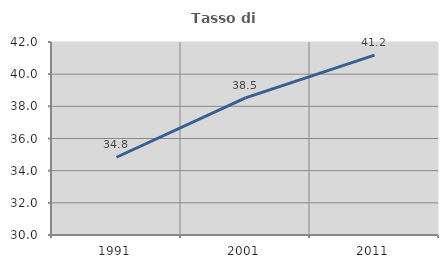
| Category | Tasso di occupazione   |
|---|---|
| 1991.0 | 34.834 |
| 2001.0 | 38.521 |
| 2011.0 | 41.181 |